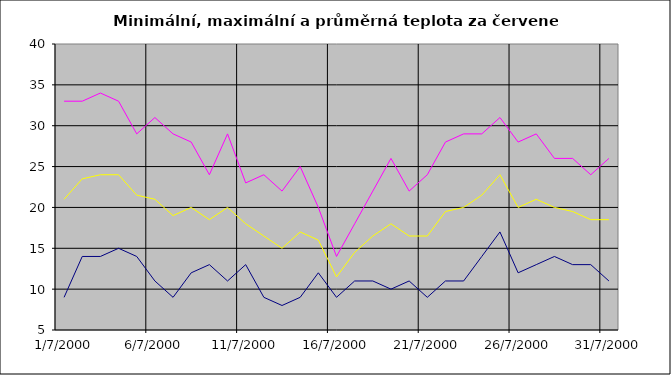
| Category | Series 0 | Series 1 | Series 2 |
|---|---|---|---|
| 2000-07-01 | 9 | 33 | 21 |
| 2000-07-02 | 14 | 33 | 23.5 |
| 2000-07-03 | 14 | 34 | 24 |
| 2000-07-04 | 15 | 33 | 24 |
| 2000-07-05 | 14 | 29 | 21.5 |
| 2000-07-06 | 11 | 31 | 21 |
| 2000-07-07 | 9 | 29 | 19 |
| 2000-07-08 | 12 | 28 | 20 |
| 2000-07-09 | 13 | 24 | 18.5 |
| 2000-07-10 | 11 | 29 | 20 |
| 2000-07-11 | 13 | 23 | 18 |
| 2000-07-12 | 9 | 24 | 16.5 |
| 2000-07-13 | 8 | 22 | 15 |
| 2000-07-14 | 9 | 25 | 17 |
| 2000-07-15 | 12 | 20 | 16 |
| 2000-07-16 | 9 | 14 | 11.5 |
| 2000-07-17 | 11 | 18 | 14.5 |
| 2000-07-18 | 11 | 22 | 16.5 |
| 2000-07-19 | 10 | 26 | 18 |
| 2000-07-20 | 11 | 22 | 16.5 |
| 2000-07-21 | 9 | 24 | 16.5 |
| 2000-07-22 | 11 | 28 | 19.5 |
| 2000-07-23 | 11 | 29 | 20 |
| 2000-07-24 | 14 | 29 | 21.5 |
| 2000-07-25 | 17 | 31 | 24 |
| 2000-07-26 | 12 | 28 | 20 |
| 2000-07-27 | 13 | 29 | 21 |
| 2000-07-28 | 14 | 26 | 20 |
| 2000-07-29 | 13 | 26 | 19.5 |
| 2000-07-30 | 13 | 24 | 18.5 |
| 2000-07-31 | 11 | 26 | 18.5 |